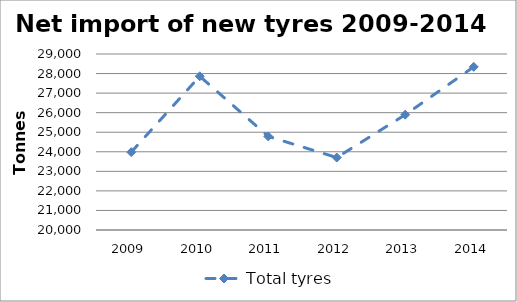
| Category | Total tyres |
|---|---|
| 2009.0 | 23981.127 |
| 2010.0 | 27861.456 |
| 2011.0 | 24786.859 |
| 2012.0 | 23705.034 |
| 2013.0 | 25896.113 |
| 2014.0 | 28342.264 |